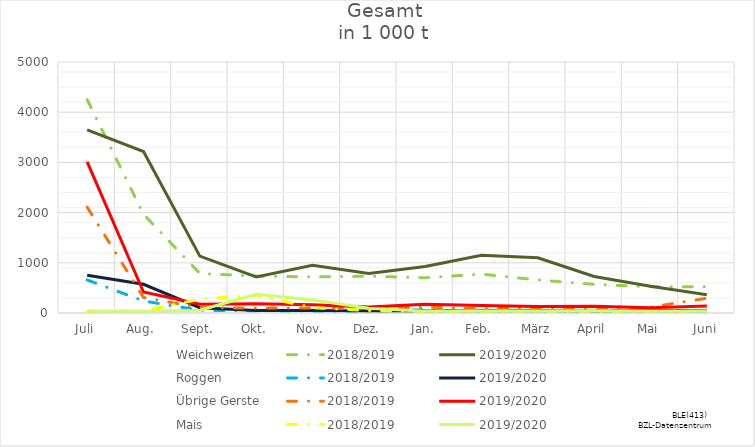
| Category | Weichweizen | 2018/2019 | 2019/2020 | Roggen | Übrige Gerste | Mais |
|---|---|---|---|---|---|---|
| Juli |  | 30.792 | 40.624 |  |  |  |
| Aug. |  | 41.781 | 34.045 |  |  |  |
| Sept. |  | 275.373 | 55.418 |  |  |  |
| Okt. |  | 354.976 | 371.554 |  |  |  |
| Nov. |  | 105.313 | 257.369 |  |  |  |
| Dez. |  | 49.167 | 93.902 |  |  |  |
| Jan. |  | 28.809 | 36.873 |  |  |  |
| Feb. |  | 25.558 | 40.985 |  |  |  |
| März |  | 24.702 | 37.368 |  |  |  |
| April |  | 23.054 | 39.205 |  |  |  |
| Mai |  | 29.219 | 38.835 |  |  |  |
| Juni |  | 31.854 | 32.907 |  |  |  |